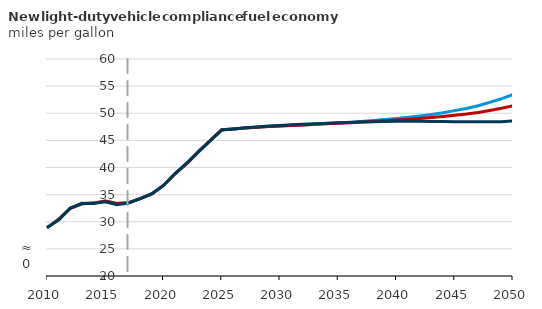
| Category | Autonomous battery electric vehicle | Autonomous hybrid electric vehicle  | Reference |
|---|---|---|---|
| 2010.0 | 28.877 | 28.877 | 28.929 |
| 2011.0 | 30.448 | 30.448 | 30.297 |
| 2012.0 | 32.474 | 32.474 | 32.524 |
| 2013.0 | 33.306 | 33.306 | 33.387 |
| 2014.0 | 33.436 | 33.436 | 33.386 |
| 2015.0 | 33.81 | 33.81 | 33.665 |
| 2016.0 | 33.356 | 33.356 | 33.159 |
| 2017.0 | 33.516 | 33.516 | 33.448 |
| 2018.0 | 34.259 | 34.256 | 34.251 |
| 2019.0 | 35.129 | 35.129 | 35.163 |
| 2020.0 | 36.689 | 36.687 | 36.688 |
| 2021.0 | 38.859 | 38.86 | 38.887 |
| 2022.0 | 40.723 | 40.719 | 40.836 |
| 2023.0 | 42.92 | 42.915 | 42.887 |
| 2024.0 | 44.953 | 44.952 | 44.913 |
| 2025.0 | 46.948 | 46.944 | 46.927 |
| 2026.0 | 47.091 | 47.096 | 47.1 |
| 2027.0 | 47.272 | 47.275 | 47.319 |
| 2028.0 | 47.416 | 47.417 | 47.485 |
| 2029.0 | 47.543 | 47.553 | 47.641 |
| 2030.0 | 47.642 | 47.648 | 47.751 |
| 2031.0 | 47.766 | 47.761 | 47.878 |
| 2032.0 | 47.857 | 47.848 | 47.97 |
| 2033.0 | 47.982 | 47.954 | 48.065 |
| 2034.0 | 48.088 | 48.056 | 48.173 |
| 2035.0 | 48.199 | 48.149 | 48.252 |
| 2036.0 | 48.322 | 48.25 | 48.304 |
| 2037.0 | 48.492 | 48.383 | 48.402 |
| 2038.0 | 48.65 | 48.495 | 48.447 |
| 2039.0 | 48.832 | 48.618 | 48.486 |
| 2040.0 | 49.048 | 48.763 | 48.522 |
| 2041.0 | 49.264 | 48.903 | 48.524 |
| 2042.0 | 49.507 | 49.046 | 48.516 |
| 2043.0 | 49.785 | 49.211 | 48.499 |
| 2044.0 | 50.102 | 49.399 | 48.48 |
| 2045.0 | 50.483 | 49.615 | 48.454 |
| 2046.0 | 50.878 | 49.852 | 48.446 |
| 2047.0 | 51.394 | 50.155 | 48.447 |
| 2048.0 | 51.999 | 50.517 | 48.449 |
| 2049.0 | 52.663 | 50.911 | 48.431 |
| 2050.0 | 53.439 | 51.378 | 48.563 |